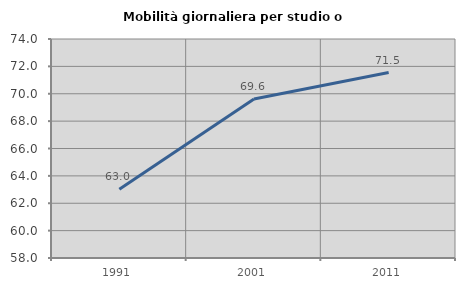
| Category | Mobilità giornaliera per studio o lavoro |
|---|---|
| 1991.0 | 63.025 |
| 2001.0 | 69.612 |
| 2011.0 | 71.548 |